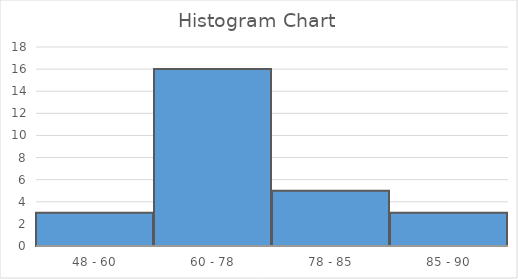
| Category | Frequency |
|---|---|
| 48 - 60 | 3 |
| 60 - 78 | 16 |
| 78 - 85 | 5 |
| 85 - 90 | 3 |